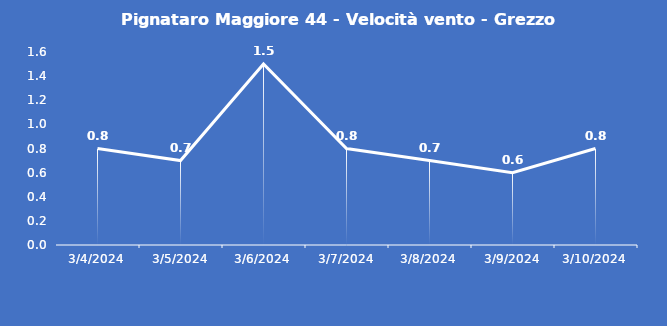
| Category | Pignataro Maggiore 44 - Velocità vento - Grezzo (m/s) |
|---|---|
| 3/4/24 | 0.8 |
| 3/5/24 | 0.7 |
| 3/6/24 | 1.5 |
| 3/7/24 | 0.8 |
| 3/8/24 | 0.7 |
| 3/9/24 | 0.6 |
| 3/10/24 | 0.8 |